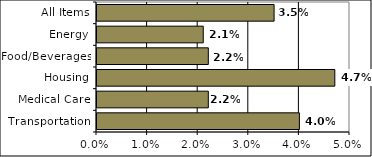
| Category | Series 0 |
|---|---|
| Transportation | 0.04 |
| Medical Care | 0.022 |
| Housing | 0.047 |
| Food/Beverages | 0.022 |
| Energy | 0.021 |
| All Items | 0.035 |